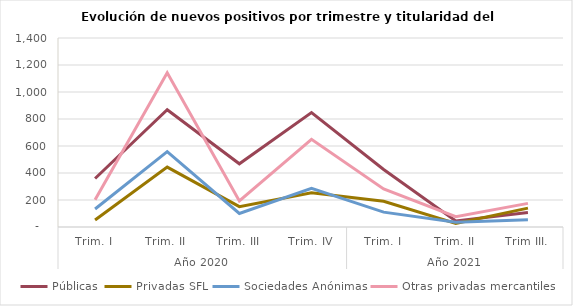
| Category | Públicas | Privadas SFL | Sociedades Anónimas | Otras privadas mercantiles |
|---|---|---|---|---|
| 0 | 359 | 52 | 133 | 201 |
| 1 | 869 | 444 | 558 | 1143 |
| 2 | 468 | 151 | 100 | 193 |
| 3 | 848 | 254 | 287 | 649 |
| 4 | 426 | 191 | 110 | 282 |
| 5 | 45 | 26 | 35 | 76 |
| 6 | 108 | 140 | 54 | 175 |